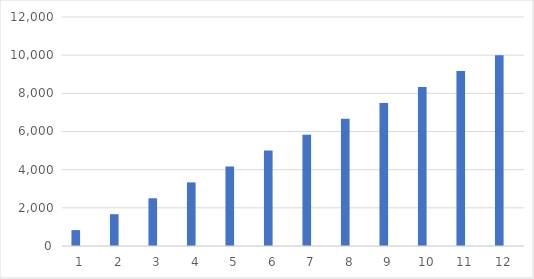
| Category | Ziel | Wörter |
|---|---|---|
| 0 | 833.333 | 0 |
| 1 | 1666.667 | 0 |
| 2 | 2500 | 0 |
| 3 | 3333.333 | 0 |
| 4 | 4166.667 | 0 |
| 5 | 5000 | 0 |
| 6 | 5833.333 | 0 |
| 7 | 6666.667 | 0 |
| 8 | 7500 | 0 |
| 9 | 8333.333 | 0 |
| 10 | 9166.667 | 0 |
| 11 | 10000 | 0 |